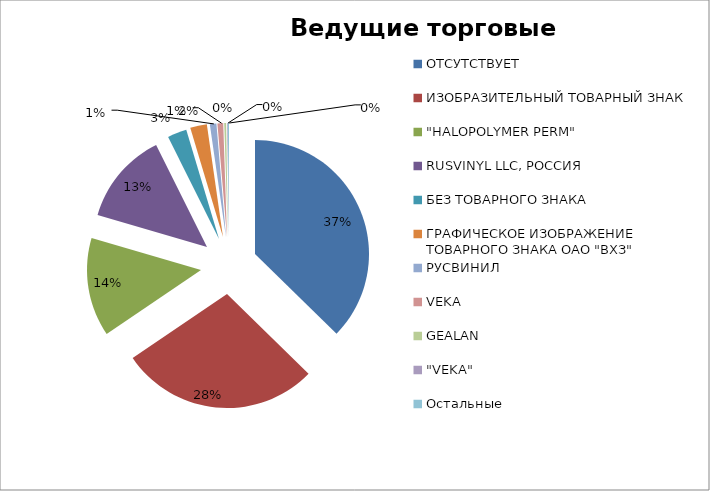
| Category | Стоимость, USD |
|---|---|
| ОТСУТСТВУЕТ | 3707566.77 |
| ИЗОБРАЗИТЕЛЬНЫЙ ТОВАРНЫЙ ЗНАК | 2802336.1 |
| "HALOPOLYMER PERM" | 1391071.4 |
| RUSVINYL LLC, РОССИЯ | 1303794.26 |
| БЕЗ ТОВАРНОГО ЗНАКА | 270850 |
| ГРАФИЧЕСКОЕ ИЗОБРАЖЕНИЕ ТОВАРНОГО ЗНАКА ОАО "ВХЗ" | 235504.61 |
| РУСВИНИЛ | 91899.81 |
| VEKA | 80758.05 |
| GEALAN | 26340.26 |
| "VEKA" | 9669.46 |
| Остальные | 16590.94 |